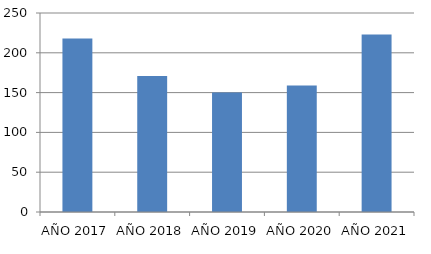
| Category | Series 0 |
|---|---|
| AÑO 2017 | 218 |
| AÑO 2018 | 171 |
| AÑO 2019 | 150 |
| AÑO 2020 | 159 |
| AÑO 2021 | 223 |